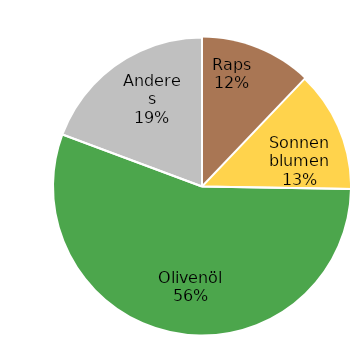
| Category | Series 0 |
|---|---|
| Raps | 22.722 |
| Sonnenblumen | 24.641 |
| Olivenöl | 103.857 |
| Anderes | 36.225 |